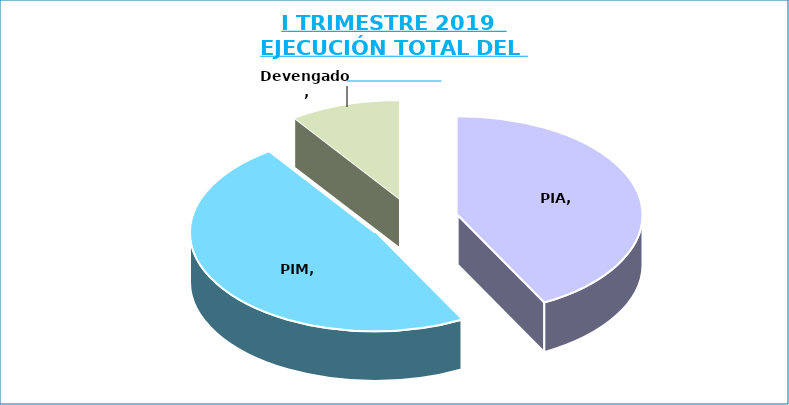
| Category | Series 0 |
|---|---|
| PIA | 1816836249 |
| PIM | 2067579599 |
| Devengado  | 417193778 |